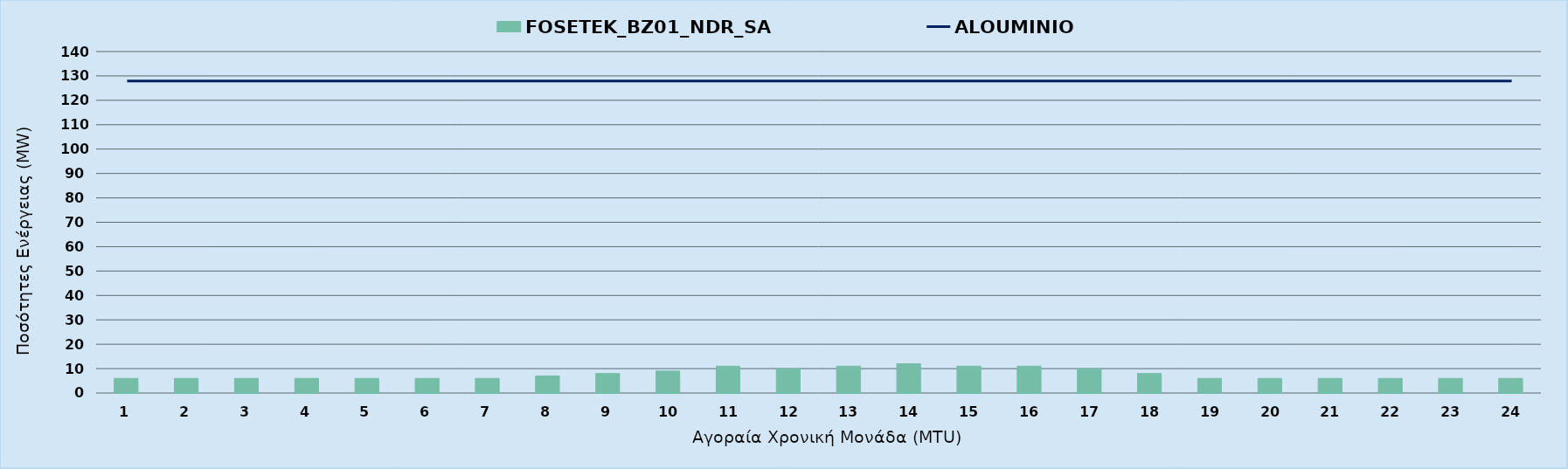
| Category | FOSETEK_BZ01_NDR_SA |
|---|---|
| 0 | 6 |
| 1 | 6 |
| 2 | 6 |
| 3 | 6 |
| 4 | 6 |
| 5 | 6 |
| 6 | 6 |
| 7 | 7 |
| 8 | 8 |
| 9 | 9 |
| 10 | 11 |
| 11 | 10 |
| 12 | 11 |
| 13 | 12 |
| 14 | 11 |
| 15 | 11 |
| 16 | 10 |
| 17 | 8 |
| 18 | 6 |
| 19 | 6 |
| 20 | 6 |
| 21 | 6 |
| 22 | 6 |
| 23 | 6 |